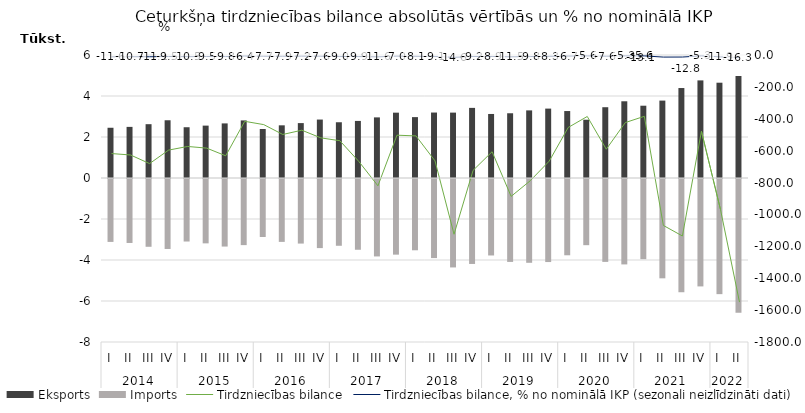
| Category | Eksports | Imports |
|---|---|---|
| 0 | 2450.7 | -3068.8 |
| 1 | 2493.4 | -3120.5 |
| 2 | 2625.5 | -3306.5 |
| 3 | 2816.7 | -3413.2 |
| 4 | 2476.5 | -3050.1 |
| 5 | 2555.2 | -3139.2 |
| 6 | 2663.4 | -3295.5 |
| 7 | 2809.5 | -3225.4 |
| 8 | 2391.5 | -2828.1 |
| 9 | 2569.5 | -3068 |
| 10 | 2678.2 | -3149.9 |
| 11 | 2850.8 | -3370.5 |
| 12 | 2719.6 | -3257.4 |
| 13 | 2783.8 | -3452 |
| 14 | 2956.9 | -3777.4 |
| 15 | 3187 | -3690 |
| 16 | 2969.9 | -3477.4 |
| 17 | 3193.3 | -3857.4 |
| 18 | 3189.7 | -4313.9 |
| 19 | 3420.5 | -4144.2 |
| 20 | 3123.6 | -3730.2 |
| 21 | 3158.2 | -4044.8 |
| 22 | 3298.5 | -4087.5 |
| 23 | 3385.3 | -4051.1 |
| 24 | 3266.4 | -3720.9 |
| 25 | 2842.7 | -3228.3 |
| 26 | 3452.8 | -4043.7 |
| 27 | 3742.7 | -4166.6 |
| 28 | 3526.2 | -3910.7 |
| 29 | 3776 | -4844.9 |
| 30 | 4388.7 | -5523.8 |
| 31 | 4761.5 | -5239.5 |
| 32 | 4648.4 | -5616.8 |
| 33 | 4975.5 | -6525.2 |